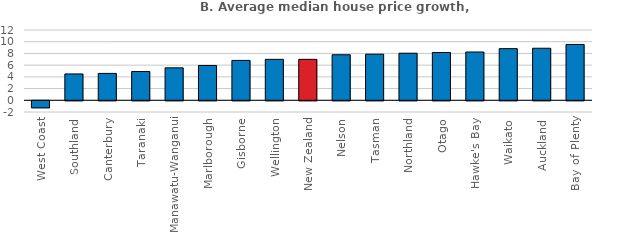
| Category | 2012-18 |
|---|---|
| West Coast | -1.198 |
| Southland | 4.498 |
| Canterbury | 4.588 |
| Taranaki | 4.912 |
| Manawatu-Wanganui | 5.541 |
| Marlborough | 5.945 |
| Gisborne | 6.811 |
| Wellington | 6.991 |
| New Zealand | 6.991 |
| Nelson | 7.775 |
| Tasman | 7.873 |
| Northland | 8.034 |
| Otago | 8.161 |
| Hawke's Bay | 8.246 |
| Waikato | 8.817 |
| Auckland | 8.887 |
| Bay of Plenty | 9.537 |